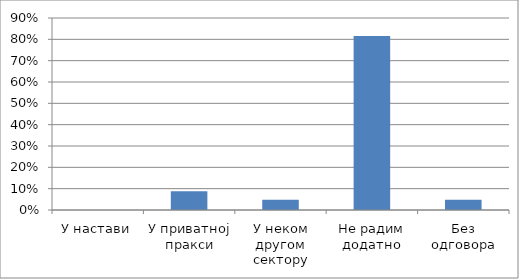
| Category | Series 0 |
|---|---|
| У настави | 0 |
| У приватној пракси | 0.087 |
| У неком другом сектору | 0.049 |
| Не радим додатно | 0.816 |
| Без одговора | 0.049 |